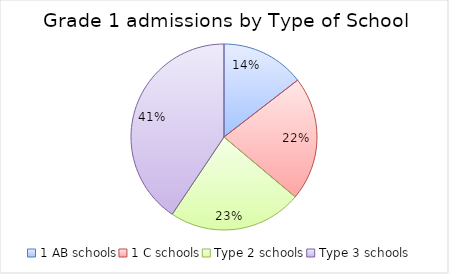
| Category | Series 0 |
|---|---|
| 1 AB schools | 47651 |
| 1 C schools | 70819 |
| Type 2 schools | 76305 |
| Type 3 schools | 133150 |